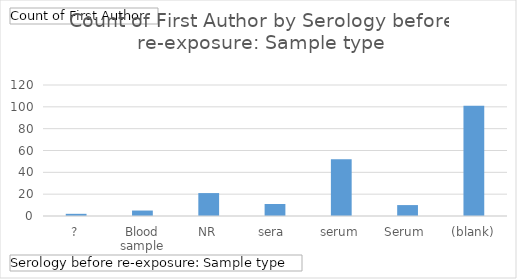
| Category | Total |
|---|---|
| ? | 2 |
| Blood sample | 5 |
| NR | 21 |
| sera  | 11 |
| serum | 52 |
| Serum  | 10 |
| (blank) | 101 |